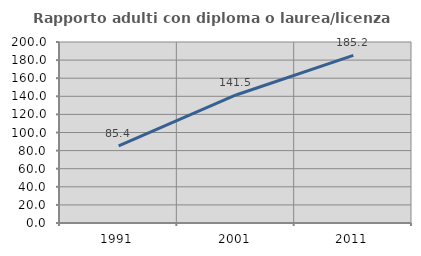
| Category | Rapporto adulti con diploma o laurea/licenza media  |
|---|---|
| 1991.0 | 85.353 |
| 2001.0 | 141.481 |
| 2011.0 | 185.199 |